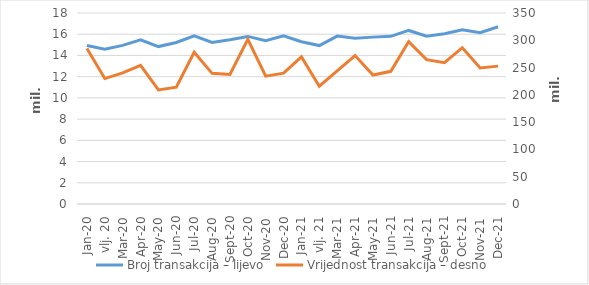
| Category | Broj transakcija – lijevo |
|---|---|
| sij.20 | 14934534 |
| vlj. 20 | 14581295 |
| ožu.20 | 14949924 |
| tra.20 | 15475047 |
| svi.20 | 14836361 |
| lip.20 | 15221341 |
| srp.20 | 15852587 |
| kol.20 | 15230743 |
| ruj.20 | 15480174 |
| lis.20 | 15793838 |
| stu.20 | 15391839 |
| pro.20 | 15841467 |
| sij.21 | 15286372 |
| vlj. 21 | 14928885 |
| ožu.21 | 15822612 |
| tra.21 | 15615856 |
| svi.21 | 15726566 |
| lip.21 | 15798196 |
| srp.21 | 16355712 |
| kol.21 | 15821262 |
| ruj.21 | 16048157 |
| lis.21 | 16429561 |
| stu.21 | 16144002 |
| pro.21 | 16705233 |